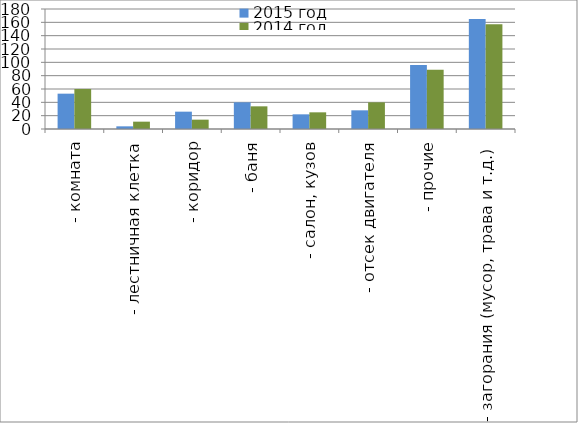
| Category | 2015 год | 2014 год |
|---|---|---|
|  - комната | 53 | 60 |
|  - лестничная клетка | 4 | 11 |
|  - коридор | 26 | 14 |
|  - баня | 40 | 34 |
|  - салон, кузов | 22 | 25 |
|  - отсек двигателя | 28 | 40 |
| - прочие | 96 | 89 |
| - загорания (мусор, трава и т.д.)  | 165 | 157 |